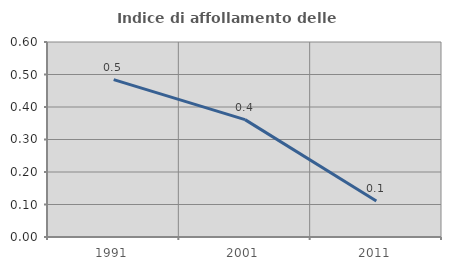
| Category | Indice di affollamento delle abitazioni  |
|---|---|
| 1991.0 | 0.484 |
| 2001.0 | 0.361 |
| 2011.0 | 0.111 |